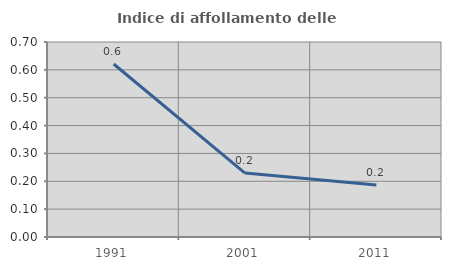
| Category | Indice di affollamento delle abitazioni  |
|---|---|
| 1991.0 | 0.621 |
| 2001.0 | 0.229 |
| 2011.0 | 0.186 |